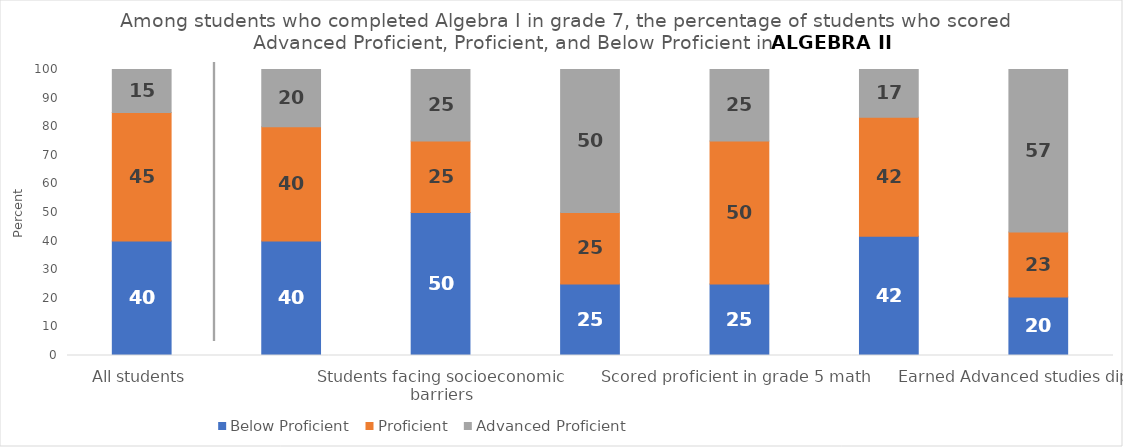
| Category | Below Proficient | Proficient | Advanced Proficient |
|---|---|---|---|
| All students | 40 | 45 | 15 |
| Multilingual learners | 40 | 40 | 20 |
| Students facing socioeconomic barriers | 50 | 25 | 25 |
| Scored advanced proficient in grade 5 math | 25 | 25 | 50 |
| Scored proficient in grade 5 math | 25 | 50 | 25 |
| Earned Standard diploma | 41.667 | 41.667 | 16.667 |
| Earned Advanced studies diploma | 20.455 | 22.727 | 56.818 |